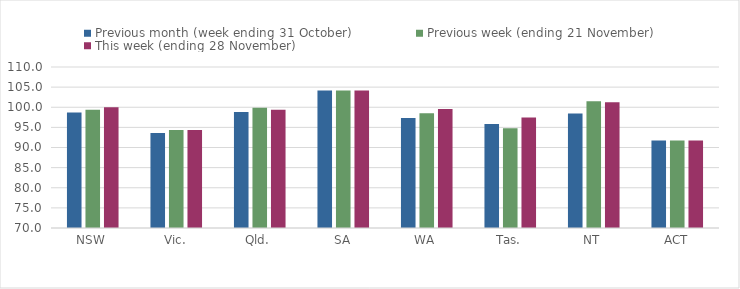
| Category | Previous month (week ending 31 October) | Previous week (ending 21 November) | This week (ending 28 November) |
|---|---|---|---|
| NSW | 98.68 | 99.38 | 100.03 |
| Vic. | 93.61 | 94.35 | 94.35 |
| Qld. | 98.8 | 99.85 | 99.36 |
| SA | 104.14 | 104.14 | 104.14 |
| WA | 97.31 | 98.49 | 99.59 |
| Tas. | 95.84 | 94.8 | 97.46 |
| NT | 98.45 | 101.5 | 101.23 |
| ACT | 91.72 | 91.72 | 91.72 |